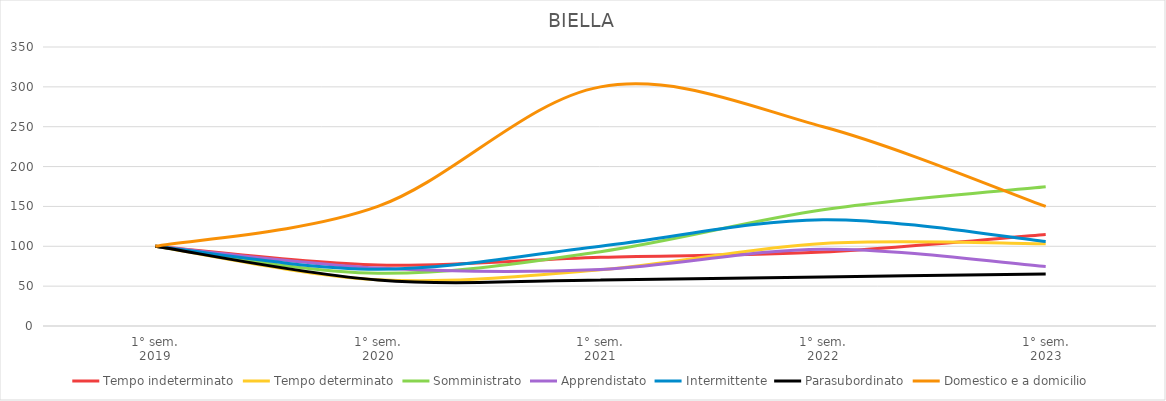
| Category | Tempo indeterminato | Tempo determinato | Somministrato | Apprendistato | Intermittente | Parasubordinato | Domestico e a domicilio |
|---|---|---|---|---|---|---|---|
| 1° sem.
2019 | 100 | 100 | 100 | 100 | 100 | 100 | 100 |
| 1° sem.
2020 | 76.423 | 58.018 | 66.102 | 72.727 | 71.3 | 57.692 | 150 |
| 1° sem.
2021 | 86.179 | 70.45 | 93.22 | 70.909 | 100.181 | 57.692 | 300 |
| 1° sem.
2022 | 92.683 | 103.423 | 145.763 | 96.364 | 133.394 | 61.538 | 250 |
| 1° sem.
2023 | 114.634 | 103.063 | 174.576 | 74.545 | 105.957 | 65.385 | 150 |